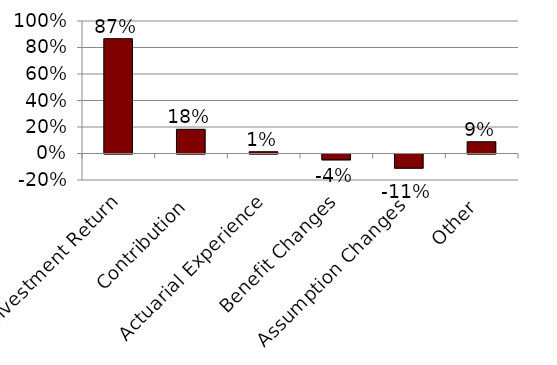
| Category | Series 0 |
|---|---|
| Investment Return | 0.866 |
| Contribution | 0.183 |
| Actuarial Experience | 0.013 |
| Benefit Changes | -0.044 |
| Assumption Changes | -0.107 |
| Other | 0.089 |